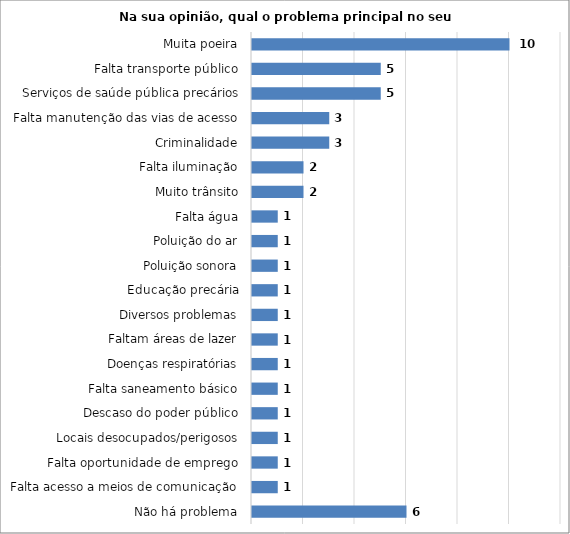
| Category | Series 0 |
|---|---|
| Não há problema | 6 |
| Falta acesso a meios de comunicação | 1 |
| Falta oportunidade de emprego | 1 |
| Locais desocupados/perigosos | 1 |
| Descaso do poder público | 1 |
| Falta saneamento básico | 1 |
| Doenças respiratórias | 1 |
| Faltam áreas de lazer | 1 |
| Diversos problemas | 1 |
| Educação precária | 1 |
| Poluição sonora | 1 |
| Poluição do ar | 1 |
| Falta água | 1 |
| Muito trânsito | 2 |
| Falta iluminação | 2 |
| Criminalidade | 3 |
| Falta manutenção das vias de acesso | 3 |
| Serviços de saúde pública precários | 5 |
| Falta transporte público | 5 |
| Muita poeira | 10 |